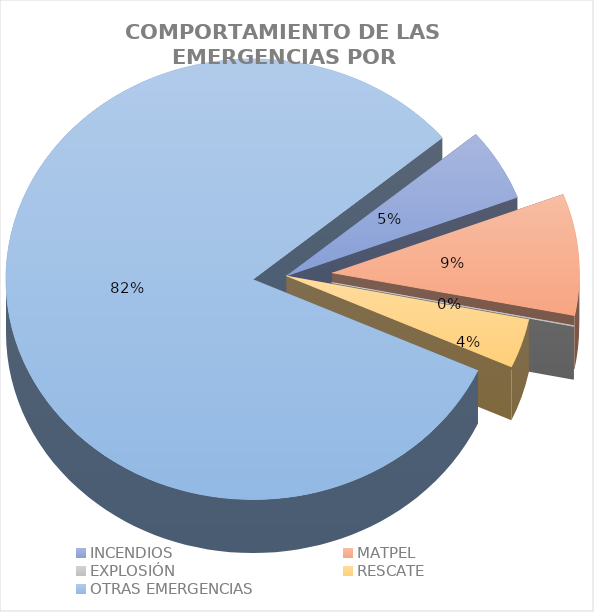
| Category | Series 0 |
|---|---|
| INCENDIOS | 0.053 |
| MATPEL | 0.089 |
| EXPLOSIÓN | 0.001 |
| RESCATE | 0.036 |
| OTRAS EMERGENCIAS | 0.821 |